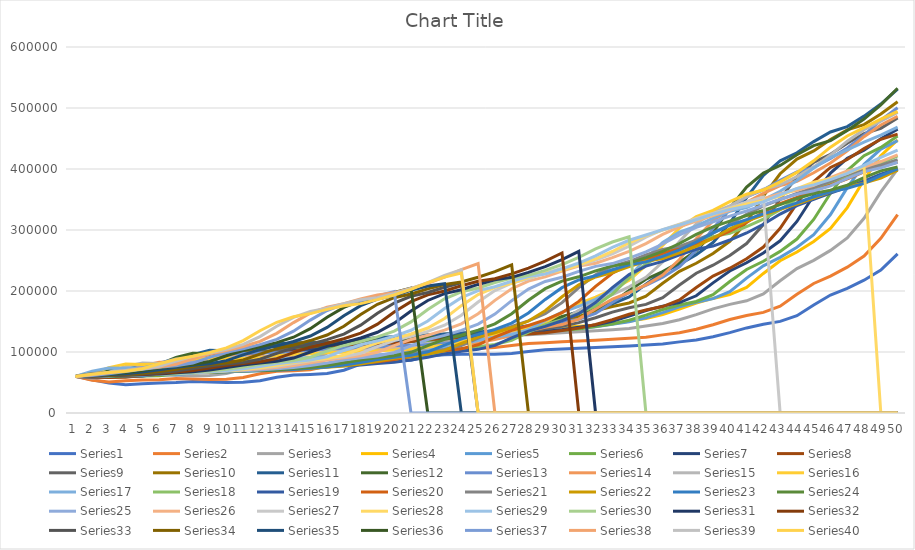
| Category | Series 0 | Series 1 | Series 2 | Series 3 | Series 4 | Series 5 | Series 6 | Series 7 | Series 8 | Series 9 | Series 10 | Series 11 | Series 12 | Series 13 | Series 14 | Series 15 | Series 16 | Series 17 | Series 18 | Series 19 | Series 20 | Series 21 | Series 22 | Series 23 | Series 24 | Series 25 | Series 26 | Series 27 | Series 28 | Series 29 | Series 30 | Series 31 | Series 32 | Series 33 | Series 34 | Series 35 | Series 36 | Series 37 | Series 38 | Series 39 |
|---|---|---|---|---|---|---|---|---|---|---|---|---|---|---|---|---|---|---|---|---|---|---|---|---|---|---|---|---|---|---|---|---|---|---|---|---|---|---|---|---|
| 0 | 60000 | 60000 | 60000 | 60000 | 60000 | 60000 | 60000 | 60000 | 60000 | 60000 | 60000 | 60000 | 60000 | 60000 | 60000 | 60000 | 60000 | 60000 | 60000 | 60000 | 60000 | 60000 | 60000 | 60000 | 60000 | 60000 | 60000 | 60000 | 60000 | 60000 | 60000 | 60000 | 60000 | 60000 | 60000 | 60000 | 60000 | 60000 | 60000 | 60000 |
| 1 | 54640.719 | 53819.178 | 56884.545 | 62087.629 | 61531.756 | 60619.308 | 62235.577 | 58783.314 | 59219.397 | 60431.396 | 63069.601 | 66553.48 | 63581.633 | 60982.186 | 61364.282 | 65085.688 | 68633.646 | 64613.662 | 59417.678 | 60651.033 | 64716.066 | 61367.576 | 60489.642 | 60186.799 | 59832.402 | 60915.033 | 62004.905 | 61637.496 | 60606.411 | 60874.786 | 60642.434 | 60719.264 | 60743.802 | 60767.347 | 60951.102 | 61809.045 | 61663.671 | 62563.078 | 63277.432 | 63502.953 |
| 2 | 49011.976 | 51024.658 | 58863.775 | 63672.68 | 62166.874 | 62877.96 | 60973.558 | 58018.54 | 59645.18 | 63523.068 | 69958.358 | 70526.316 | 64622.449 | 62368.801 | 66565.609 | 74451.135 | 73911.187 | 63986.562 | 60062.392 | 65418.271 | 66191.136 | 61868.379 | 60677.966 | 60018.68 | 60744.879 | 62950.514 | 63697.118 | 62260.457 | 61490.038 | 61526.587 | 61369.4 | 61471.982 | 61520.661 | 61730.612 | 62788.823 | 63522.878 | 64297.818 | 65980.515 | 66971.73 | 66228.987 |
| 3 | 46467.066 | 52800 | 60366.524 | 64329.897 | 64483.188 | 61602.914 | 60180.288 | 58435.689 | 62696.629 | 70461.354 | 74134.444 | 71680.815 | 66091.837 | 67655.272 | 76144.008 | 80176.007 | 73193.851 | 64680.851 | 64783.362 | 66909.345 | 66731.302 | 62060.995 | 60508.475 | 60933.997 | 62774.674 | 64668.534 | 64340.895 | 63168.199 | 62148.426 | 62264.151 | 62130.178 | 62258.154 | 62495.868 | 63591.837 | 64529.823 | 66236.445 | 67810.013 | 69832.626 | 69846.67 | 68396.184 |
| 4 | 48083.832 | 54147.945 | 60989.615 | 66726.804 | 63175.592 | 60801.457 | 60612.981 | 61425.261 | 69544.648 | 74667.466 | 75348.007 | 73310.696 | 71693.878 | 77390.467 | 81999.053 | 79397.869 | 73988.044 | 69764.838 | 66259.965 | 67455.373 | 66939.058 | 61887.64 | 61431.262 | 62970.112 | 64487.896 | 65322.129 | 65278.97 | 63844.557 | 62893.445 | 63036.021 | 62924.768 | 63245.052 | 64380.165 | 65355.102 | 67286.405 | 69854.536 | 71768.935 | 72830.377 | 72132.247 | 72621.536 |
| 5 | 49311.377 | 54706.849 | 63262.065 | 65373.711 | 62353.674 | 61238.616 | 63713.942 | 68134.415 | 73696.038 | 75889.754 | 77061.273 | 79524.618 | 82010.204 | 83341.358 | 81203.221 | 80259.379 | 79803.587 | 71354.983 | 66800.693 | 67665.383 | 66752.078 | 62831.461 | 63483.992 | 64688.667 | 65139.665 | 66274.51 | 65977.928 | 64609.908 | 63673.116 | 63842.196 | 63922.232 | 65151.938 | 66165.289 | 68146.939 | 70961.848 | 73932.822 | 74849.807 | 75213.59 | 76588.404 | 80649.705 |
| 6 | 49820.359 | 56745.205 | 61979.23 | 64523.196 | 62801.993 | 64371.585 | 70673.077 | 72201.622 | 74902.425 | 77615.339 | 83593.099 | 90967.742 | 88316.327 | 82532.499 | 82084.32 | 86567.855 | 81622.545 | 71937.29 | 67008.666 | 67476.374 | 67770.083 | 64930.979 | 65216.572 | 65342.466 | 66089.385 | 66984.127 | 66768.853 | 65410.857 | 64487.439 | 64854.202 | 65849.535 | 66958.461 | 68991.736 | 71869.388 | 75104.782 | 77106.586 | 77299.101 | 79860.105 | 85055.103 | 88023.626 |
| 7 | 51676.647 | 55594.521 | 61172.877 | 64987.113 | 66014.944 | 71402.55 | 74891.827 | 73383.546 | 76605.559 | 84194.128 | 95621.654 | 97962.649 | 87459.184 | 83428.021 | 88536.239 | 88540.991 | 82288.642 | 72161.254 | 66821.49 | 68505.425 | 70034.626 | 66703.05 | 65875.706 | 66295.143 | 66797.02 | 67787.115 | 67596.567 | 66247.404 | 65509.674 | 66809.605 | 67675.402 | 69818.79 | 72760.331 | 76065.306 | 78328.855 | 79629.728 | 82074.454 | 88688.484 | 92831.816 | 93080.418 |
| 8 | 50628.743 | 54871.233 | 61612.706 | 68311.856 | 73225.405 | 75664.845 | 76117.788 | 75052.144 | 83098.758 | 96309.167 | 102974.42 | 97011.885 | 88408.163 | 89985.556 | 90554.24 | 89263.548 | 82544.833 | 71959.686 | 67840.555 | 70794.54 | 71945.983 | 67377.207 | 66836.158 | 67004.981 | 67597.765 | 68627.451 | 68461.067 | 67297.538 | 67484.84 | 68662.093 | 70566.357 | 73632.562 | 77008.264 | 79330.612 | 80891.994 | 84549.061 | 91147.625 | 96797.402 | 98164.83 | 99132.213 |
| 9 | 49970.06 | 55265.753 | 64764.814 | 75773.196 | 77596.513 | 76903.461 | 77848.558 | 81413.673 | 95056.18 | 103714.799 | 101975.015 | 98064.516 | 95357.143 | 92036.591 | 91293.226 | 89541.454 | 82314.261 | 73057.111 | 70107.452 | 72726.636 | 72673.13 | 68359.551 | 67551.789 | 67808.219 | 68435.754 | 69505.135 | 69546.291 | 69326.609 | 69356.05 | 71595.197 | 74420.964 | 77931.419 | 80314.05 | 81926.531 | 85889.307 | 93895.795 | 99481.386 | 102358.231 | 104547.197 | 106696.956 |
| 10 | 50329.341 | 58093.151 | 71838.729 | 80296.392 | 78866.75 | 78652.095 | 84447.115 | 93128.621 | 102365.464 | 102708.209 | 103081.499 | 105772.496 | 97530.612 | 92787.675 | 91577.451 | 89291.339 | 83569.599 | 75498.32 | 72020.797 | 73461.673 | 73732.687 | 69091.493 | 68361.582 | 68648.817 | 69310.987 | 70606.909 | 71643.164 | 71248.888 | 72318.799 | 75506.003 | 78765.85 | 81276.833 | 82942.149 | 86987.755 | 95384.202 | 102480.825 | 105196.406 | 109013.24 | 112525.156 | 118705.134 |
| 11 | 52904.192 | 64438.356 | 76127.062 | 81610.825 | 80660.025 | 85318.761 | 96598.558 | 100289.687 | 101371.969 | 103822.648 | 111183.819 | 108183.362 | 98326.531 | 93076.553 | 91321.648 | 90653.08 | 86362.084 | 77558.791 | 72748.7 | 74532.727 | 74522.161 | 69919.743 | 69209.04 | 69526.775 | 70409.683 | 72735.761 | 73629.675 | 74292.495 | 76269.131 | 79914.237 | 82147.084 | 83936.437 | 88066.116 | 96604.082 | 104105.32 | 108368.157 | 112035.944 | 117332.001 | 125189.267 | 134788.732 |
| 12 | 58682.635 | 68284.932 | 77373.244 | 83466.495 | 87496.887 | 97595.628 | 104026.442 | 99316.338 | 102471.91 | 111983.223 | 113718.025 | 109066.214 | 98632.653 | 92816.562 | 92714.353 | 93682.26 | 88719.044 | 78342.665 | 73809.359 | 75330.767 | 75415.512 | 70786.517 | 70094.162 | 70628.892 | 72532.588 | 74752.568 | 76774.985 | 78350.638 | 80721.917 | 83344.768 | 84835.165 | 89121.829 | 97801.653 | 105436.735 | 110085.975 | 115413.912 | 120585.366 | 130537.097 | 142151.414 | 148718.764 |
| 13 | 62185.629 | 69402.74 | 79132.56 | 90541.237 | 100087.173 | 105100.182 | 103016.827 | 100393.975 | 110526.316 | 114535.65 | 114646.044 | 109405.772 | 98357.143 | 94232.065 | 95812.411 | 96239 | 89615.713 | 79484.882 | 74599.653 | 76233.812 | 76350.416 | 71691.814 | 71205.273 | 72758.406 | 74543.762 | 77945.845 | 80968.731 | 82924.948 | 84187.121 | 86072.041 | 90076.078 | 98974.073 | 106743.802 | 111493.878 | 117243.417 | 124221.106 | 134156.611 | 148223.832 | 156842.357 | 157837.347 |
| 14 | 63203.593 | 70980.822 | 85839.951 | 103569.588 | 107783.313 | 104080.146 | 104134.615 | 108285.052 | 113045.535 | 115470.342 | 115002.974 | 109100.17 | 99857.143 | 97380.838 | 98427.286 | 97211.672 | 90922.289 | 80335.946 | 75493.934 | 77178.859 | 77326.87 | 72828.25 | 73352.166 | 74775.841 | 77728.119 | 82203.548 | 85695.892 | 86484.723 | 86941.958 | 91389.365 | 100033.812 | 108023.418 | 112876.033 | 118742.857 | 126190.22 | 138201.534 | 152333.761 | 163542.343 | 166459.032 | 162907.769 |
| 15 | 64640.719 | 76997.26 | 98191.814 | 111533.505 | 106737.235 | 105209.472 | 112319.711 | 110753.187 | 113968.066 | 115829.838 | 114681.737 | 110764.007 | 103193.878 | 100038.517 | 99422.075 | 98628.995 | 91895.816 | 81298.992 | 76429.809 | 78165.908 | 78552.632 | 75024.077 | 75386.064 | 77970.112 | 81973.929 | 87002.801 | 89374.617 | 89314.743 | 92313.023 | 101492.281 | 109180.051 | 114229.161 | 120214.876 | 127804.082 | 140392.262 | 156926.739 | 168077.022 | 173569.823 | 171806.421 | 169913.676 |
| 16 | 70119.76 | 88076.712 | 105742.211 | 110451.031 | 107895.392 | 113479.053 | 114879.808 | 111657.01 | 114322.886 | 115506.291 | 116430.696 | 114465.195 | 106010.204 | 101049.591 | 100871.625 | 99685.039 | 92997.438 | 82306.831 | 77407.279 | 79404.97 | 80921.053 | 77104.334 | 78606.403 | 82229.141 | 86759.777 | 90737.628 | 92299.203 | 94832.394 | 102518.048 | 110771.87 | 115452.24 | 121655.98 | 129388.43 | 142187.755 | 159414.293 | 173144.671 | 178382.542 | 179145.641 | 179195.017 | 175938.21 |
| 17 | 80209.581 | 94849.315 | 104715.944 | 111649.485 | 116376.09 | 116065.574 | 115817.308 | 112004.635 | 114003.548 | 117267.825 | 120321.237 | 117589.134 | 107081.633 | 102522.87 | 101951.682 | 100880.037 | 94150.299 | 83359.462 | 78634.315 | 81799.09 | 83164.82 | 80398.074 | 82900.188 | 87029.888 | 90484.171 | 93706.816 | 98001.226 | 105315.93 | 111891.424 | 117135.506 | 122958.58 | 130939.504 | 143950.413 | 161453.061 | 175889.307 | 183760.91 | 184112.965 | 186849.863 | 185548.634 | 179277.601 |
| 18 | 86377.246 | 93928.767 | 105852.169 | 120425.258 | 119028.643 | 117012.75 | 116177.885 | 111691.773 | 115742.164 | 121186.339 | 123604.997 | 118777.589 | 108642.857 | 103620.607 | 103173.851 | 102130.616 | 95354.398 | 84680.851 | 81005.199 | 84067.203 | 86717.452 | 84789.727 | 87740.113 | 90765.878 | 93445.065 | 99495.798 | 108835.071 | 114945.12 | 118319.376 | 124751.286 | 132341.505 | 145676.052 | 163454.545 | 178138.776 | 186673.831 | 189664.11 | 192030.809 | 193474.894 | 189070.436 | 185847.342 |
| 19 | 85538.922 | 94947.945 | 114172.266 | 123170.103 | 120000 | 117377.049 | 115853.365 | 113395.133 | 119609.698 | 124493.709 | 124854.253 | 120509.338 | 109806.122 | 104862.783 | 104452.866 | 103436.776 | 96865.927 | 87234.043 | 83251.3 | 87658.383 | 91454.294 | 89739.968 | 91506.591 | 93735.99 | 99217.877 | 110494.865 | 118786.021 | 121548.502 | 126012.128 | 134271.012 | 147235.841 | 165413.995 | 180347.107 | 189061.224 | 192670.607 | 197820.682 | 198839.538 | 197147.14 | 195999.042 | 193425.716 |
| 20 | 86467.066 | 102410.959 | 116774.588 | 124175.258 | 120373.599 | 117049.18 | 117620.192 | 117184.241 | 122874.039 | 125751.947 | 126674.598 | 121799.66 | 111122.449 | 106162.735 | 105788.726 | 105076.424 | 99786.507 | 89652.856 | 86807.626 | 92446.622 | 96793.629 | 93592.295 | 94500.942 | 99526.775 | 110186.22 | 120597.572 | 125610.055 | 129451.201 | 135628.068 | 149382.504 | 167185.123 | 182509.06 | 191404.959 | 195134.694 | 200956.475 | 204834.7 | 0 | 204371.721 | 203991.375 | 202762.381 |
| 21 | 93263.473 | 104745.206 | 117727.55 | 124561.856 | 120037.36 | 118834.244 | 121550.481 | 120382.387 | 124115.908 | 127585.38 | 128030.934 | 123259.762 | 112500 | 107520.462 | 107465.656 | 108244.558 | 102553.373 | 93482.643 | 91549.393 | 97843.892 | 100948.753 | 96654.896 | 100338.983 | 110529.265 | 120260.708 | 127525.677 | 133776.824 | 139329.576 | 150892.29 | 169622.642 | 184463.229 | 193699.47 | 197553.719 | 203526.531 | 208081.677 | 0 | 0 | 212705.471 | 213838.045 | 213707.406 |
| 22 | 95389.222 | 105600 | 118094.074 | 124213.918 | 121867.995 | 122805.1 | 124867.788 | 121599.073 | 125925.488 | 128951.468 | 129565.735 | 124787.776 | 113938.776 | 109224.844 | 110705.827 | 111245.947 | 106934.244 | 98589.026 | 96894.281 | 102044.102 | 104252.078 | 102626.003 | 111431.262 | 120635.118 | 127169.46 | 135816.993 | 143985.285 | 155010.383 | 171336.991 | 187152.659 | 195773.457 | 199921.94 | 206049.587 | 210742.857 | 212031.166 | 0 | 0 | 222972.771 | 225380.93 | 222757.837 |
| 23 | 96167.665 | 105928.767 | 117764.203 | 126108.247 | 125940.224 | 126156.648 | 126129.808 | 123371.958 | 127273.802 | 130497.304 | 131171.922 | 126383.701 | 115744.898 | 112518.055 | 113775.462 | 115998.147 | 112775.406 | 104344.905 | 101053.726 | 105383.269 | 110692.521 | 113971.108 | 121619.586 | 127565.38 | 135437.616 | 146181.139 | 160190.067 | 176013.052 | 189044.181 | 198627.787 | 202062.553 | 208519.654 | 213355.372 | 214742.857 | 0 | 0 | 0 | 235008.743 | 234925.731 | 229504.771 |
| 24 | 96467.066 | 105632.877 | 119560.171 | 130322.165 | 129377.335 | 127431.694 | 127968.75 | 124692.932 | 128799.527 | 132115.039 | 132849.494 | 128387.097 | 119234.694 | 115637.939 | 118635.718 | 122334.414 | 119359.522 | 108824.188 | 104360.485 | 111893.595 | 122929.363 | 124391.653 | 128606.403 | 135859.278 | 145772.812 | 162633.053 | 181894.543 | 194203.5 | 200635.287 | 205008.576 | 210752.325 | 215913.019 | 0 | 222612.245 | 0 | 0 | 0 | 244961.279 | 0 | 0 |
| 25 | 96197.605 | 107243.836 | 123555.284 | 133878.866 | 130684.932 | 129289.617 | 129338.942 | 126187.717 | 130396.215 | 133804.674 | 134955.384 | 132258.065 | 122540.816 | 120577.756 | 125116.059 | 129476.61 | 124483.348 | 112385.218 | 110807.626 | 124263.213 | 134168.975 | 131537.721 | 136967.985 | 146226.65 | 162178.771 | 184668.534 | 200692.827 | 206110.946 | 207080.566 | 213825.043 | 218224.852 | 220011.151 | 0 | 231689.796 | 0 | 0 | 0 | 0 | 0 | 0 |
| 26 | 97664.671 | 110827.397 | 126927.306 | 135231.959 | 132590.286 | 130673.953 | 130889.423 | 127752.028 | 132063.868 | 135925.704 | 139024.39 | 135925.297 | 127775.51 | 127164.179 | 132420.654 | 135034.738 | 128556.789 | 119328.108 | 123057.192 | 135624.781 | 141876.731 | 140089.888 | 147419.962 | 162683.686 | 184152.7 | 203753.501 | 212998.161 | 212732.127 | 215986.139 | 221406.518 | 222366.864 | 228073.599 | 0 | 242873.469 | 0 | 0 | 0 | 0 | 0 | 0 |
| 27 | 100928.144 | 113852.055 | 128210.14 | 137203.608 | 134009.963 | 132240.437 | 132512.019 | 129385.863 | 134157.303 | 140023.966 | 142879.239 | 141731.749 | 134755.102 | 134588.349 | 138105.163 | 139453.451 | 136498.719 | 132519.597 | 134308.492 | 143416.171 | 151101.108 | 150780.096 | 164011.299 | 184726.027 | 203184.358 | 216246.499 | 219840.589 | 221880.747 | 223644.239 | 225608.919 | 230515.638 | 237373.85 | 0 | 0 | 0 | 0 | 0 | 0 | 0 | 0 |
| 28 | 103682.635 | 115002.74 | 130079.414 | 138672.68 | 135616.438 | 133879.781 | 134206.731 | 131436.848 | 138202.247 | 143906.531 | 148982.748 | 149473.684 | 142622.449 | 140365.912 | 142624.349 | 148068.55 | 151588.386 | 144636.058 | 142024.263 | 152740.637 | 162631.579 | 167749.599 | 186233.522 | 203816.936 | 215642.458 | 223193.277 | 229294.911 | 229747.849 | 227889.113 | 233876.501 | 239915.469 | 248831.893 | 0 | 0 | 0 | 0 | 0 | 0 | 0 | 0 |
| 29 | 104730.539 | 116679.452 | 131472.205 | 140335.052 | 137297.634 | 135591.985 | 136334.135 | 135399.768 | 142034.299 | 150053.925 | 157120.761 | 158200.34 | 148744.898 | 144959.076 | 151435.339 | 164437.239 | 165448.335 | 152945.129 | 151258.232 | 164396.22 | 180934.903 | 190478.331 | 205480.226 | 216313.823 | 222569.832 | 232791.783 | 237424.893 | 234108.573 | 236240.254 | 243413.379 | 251496.196 | 262263.73 | 0 | 0 | 0 | 0 | 0 | 0 | 0 | 0 |
| 30 | 106257.485 | 117928.767 | 133048.259 | 142074.742 | 139053.549 | 137741.348 | 140444.711 | 139154.114 | 148101.715 | 158250.449 | 166293.873 | 164991.511 | 153612.245 | 153914.3 | 168176.22 | 179471.978 | 174953.032 | 162889.138 | 162800.693 | 182898.145 | 205450.138 | 210163.724 | 218079.096 | 223262.765 | 232141.527 | 241045.752 | 241931.33 | 242687.63 | 245873.52 | 255162.95 | 265071.851 | 0 | 0 | 0 | 0 | 0 | 0 | 0 | 0 | 0 |
| 31 | 107395.21 | 119342.466 | 134697.618 | 143891.753 | 141257.783 | 141894.353 | 144338.942 | 145098.494 | 156191.603 | 167489.515 | 173432.481 | 170390.492 | 163102.041 | 170929.225 | 183552.819 | 189782.307 | 186327.925 | 175319.149 | 181123.05 | 207679.384 | 226682.825 | 223049.759 | 225084.746 | 232864.259 | 240372.44 | 245620.915 | 250797.057 | 252583.803 | 257741.842 | 268936.535 | 0 | 0 | 0 | 0 | 0 | 0 | 0 | 0 | 0 | 0 |
| 32 | 108682.635 | 120821.918 | 136420.281 | 146172.68 | 145516.812 | 145828.78 | 150504.808 | 153024.334 | 165310.467 | 174679.449 | 179107.674 | 180916.808 | 181132.653 | 186557.535 | 194097.584 | 202121.352 | 200546.541 | 195050.392 | 205663.778 | 229142.457 | 240581.717 | 230215.088 | 234764.595 | 241120.797 | 244934.823 | 254621.849 | 261023.912 | 264776.031 | 271654.635 | 280325.901 | 0 | 0 | 0 | 0 | 0 | 0 | 0 | 0 | 0 | 0 |
| 33 | 110029.94 | 122367.123 | 138582.773 | 150579.897 | 149551.681 | 152058.288 | 158725.961 | 161958.285 | 172406.86 | 180395.446 | 190172.516 | 200916.808 | 197693.878 | 197274.916 | 206717.196 | 217545.16 | 223116.994 | 221478.163 | 226918.544 | 243192.16 | 248310.249 | 240115.57 | 243088.512 | 245697.385 | 253910.615 | 265004.668 | 273623.544 | 279068.526 | 283159.111 | 288816.467 | 0 | 0 | 0 | 0 | 0 | 0 | 0 | 0 | 0 | 0 |
| 34 | 111437.126 | 124306.849 | 142761.148 | 154755.155 | 155940.224 | 160364.299 | 167992.788 | 168910.776 | 178048.492 | 191539.844 | 211195.717 | 219286.927 | 209051.02 | 210101.107 | 222491.71 | 242028.717 | 253347.566 | 244367.301 | 240831.889 | 251004.55 | 258988.92 | 248629.214 | 247702.448 | 254701.121 | 264264.432 | 277796.452 | 288393.624 | 290886.977 | 291735.49 | 0 | 0 | 0 | 0 | 0 | 0 | 0 | 0 | 0 | 0 | 0 |
| 35 | 113203.593 | 128054.795 | 146719.609 | 161365.979 | 164458.281 | 169726.776 | 175204.327 | 174438.007 | 189047.901 | 212714.2 | 230505.651 | 231884.55 | 222642.857 | 226133.847 | 247531.975 | 274821.677 | 279530.316 | 259350.504 | 248568.458 | 261799.09 | 268171.745 | 253348.315 | 256779.661 | 265087.173 | 277020.484 | 292791.783 | 300606.99 | 299697.419 | 300346.52 | 0 | 0 | 0 | 0 | 0 | 0 | 0 | 0 | 0 | 0 | 0 |
| 36 | 116616.766 | 131605.479 | 152987.172 | 170180.412 | 174059.776 | 177012.75 | 180937.5 | 185214.369 | 209946.777 | 232162.972 | 243747.769 | 246960.951 | 239632.653 | 251584.015 | 281070.583 | 303223.715 | 296669.513 | 267681.971 | 259258.232 | 271081.554 | 273261.773 | 262632.424 | 267250.471 | 277882.939 | 291973.929 | 305191.41 | 309711.833 | 308543.459 | 308177.88 | 0 | 0 | 0 | 0 | 0 | 0 | 0 | 0 | 0 | 0 | 0 |
| 37 | 119850.299 | 137227.397 | 161343.922 | 180115.979 | 181531.756 | 182805.1 | 192115.385 | 205689.455 | 229142.519 | 245500.3 | 259595.479 | 265806.452 | 266602.041 | 285671.642 | 310118.427 | 321815.655 | 306199.829 | 279193.729 | 268450.607 | 276226.811 | 283275.623 | 273341.894 | 280150.659 | 292882.939 | 304338.92 | 314435.107 | 318853.464 | 316588.549 | 316823.563 | 0 | 0 | 0 | 0 | 0 | 0 | 0 | 0 | 0 | 0 | 0 |
| 38 | 124970.06 | 144723.288 | 170763.592 | 187847.938 | 187471.98 | 194098.361 | 213353.365 | 224495.944 | 242306.328 | 261461.953 | 279405.116 | 295721.562 | 302724.49 | 315194.993 | 329133.112 | 332153.775 | 319368.061 | 289092.945 | 273545.927 | 286349.318 | 294826.87 | 286536.116 | 295273.07 | 305286.426 | 313556.797 | 323716.153 | 327167.382 | 325470.187 | 326110.309 | 0 | 0 | 0 | 0 | 0 | 0 | 0 | 0 | 0 | 0 | 0 |
| 39 | 131796.407 | 153172.603 | 178094.074 | 193994.845 | 199053.549 | 215555.556 | 232860.577 | 237392.816 | 258060.319 | 281414.02 | 310850.684 | 335789.474 | 334010.204 | 334520.944 | 339706.3 | 346438.166 | 330691.717 | 294580.067 | 283570.191 | 298025.901 | 309058.172 | 302003.21 | 307777.778 | 314533.001 | 322811.918 | 332156.863 | 336345.8 | 335010.383 | 333733.757 | 0 | 0 | 0 | 0 | 0 | 0 | 0 | 0 | 0 | 0 | 0 |
| 40 | 139491.018 | 159747.945 | 183921.808 | 205979.381 | 221058.531 | 235264.117 | 246237.981 | 252827.347 | 277752.809 | 313085.68 | 352968.471 | 370492.36 | 354489.796 | 345267.212 | 354315.49 | 358721.63 | 336968.403 | 305375.14 | 295133.449 | 312411.621 | 325740.997 | 314792.938 | 317099.812 | 323816.936 | 331229.05 | 341475.257 | 346204.782 | 342841.887 | 338914.236 | 0 | 0 | 0 | 0 | 0 | 0 | 0 | 0 | 0 | 0 | 0 |
| 41 | 145479.042 | 164975.343 | 195284.056 | 228750 | 241270.237 | 248779.599 | 262247.596 | 272120.51 | 309012.419 | 355506.291 | 389446.758 | 393208.829 | 365877.551 | 360115.551 | 366878.257 | 365530.338 | 349316.823 | 317827.548 | 309379.549 | 329275.464 | 339536.011 | 324327.448 | 326459.51 | 332260.274 | 340521.415 | 351484.594 | 354297.977 | 348163.75 | 346329.772 | 0 | 0 | 0 | 0 | 0 | 0 | 0 | 0 | 0 | 0 | 0 |
| 42 | 150239.521 | 175167.123 | 216872.327 | 249664.949 | 255130.76 | 264954.463 | 282259.615 | 302746.234 | 350881.135 | 392246.854 | 413325.402 | 405840.407 | 381612.245 | 372883.967 | 373841.781 | 378925.428 | 363561.059 | 333169.093 | 326079.723 | 343220.161 | 349819.945 | 333900.482 | 334971.751 | 341581.569 | 350502.793 | 359701.214 | 0 | 355781.667 | 358024.834 | 0 | 0 | 0 | 0 | 0 | 0 | 0 | 0 | 0 | 0 | 0 |
| 43 | 159520.958 | 194531.507 | 236701.283 | 264007.732 | 271718.555 | 285173.042 | 314026.442 | 343765.933 | 387143.702 | 416297.184 | 426603.212 | 423293.718 | 395142.857 | 379961.483 | 387541.449 | 394377.026 | 381110.162 | 351153.415 | 339889.081 | 353615.681 | 360145.429 | 342606.742 | 344369.115 | 351594.022 | 358696.462 | 365284.781 | 0 | 367795.906 | 368143.229 | 0 | 0 | 0 | 0 | 0 | 0 | 0 | 0 | 0 | 0 | 0 |
| 44 | 177155.689 | 212317.808 | 250299.328 | 281172.68 | 292453.3 | 317267.76 | 356574.519 | 379293.163 | 410881.135 | 429670.461 | 444949.435 | 438302.207 | 402642.857 | 393885.412 | 403344.386 | 413413.617 | 401682.323 | 366024.636 | 350183.709 | 364053.203 | 369536.011 | 352218.299 | 354463.277 | 359813.201 | 364264.432 | 373277.311 | 0 | 378190.448 | 373982.096 | 0 | 0 | 0 | 0 | 0 | 0 | 0 | 0 | 0 | 0 | 0 |
| 45 | 193353.293 | 224515.069 | 266572.999 | 302628.866 | 325367.372 | 360255.009 | 393425.481 | 402549.247 | 424080.426 | 448148.592 | 460725.759 | 446621.392 | 417397.959 | 409947.039 | 422813.832 | 435729.504 | 418693.424 | 377110.862 | 360519.931 | 373545.677 | 379903.047 | 362542.536 | 362749.529 | 365398.505 | 372234.637 | 385882.353 | 0 | 384188.668 | 382471.845 | 0 | 0 | 0 | 0 | 0 | 0 | 0 | 0 | 0 | 0 | 0 |
| 46 | 204461.078 | 239112.329 | 286915.088 | 336688.144 | 369452.055 | 397486.339 | 417548.077 | 415480.881 | 442318.155 | 464038.347 | 469470.553 | 462988.115 | 434418.367 | 429735.195 | 445637.139 | 454182.492 | 431374.893 | 388241.881 | 369920.277 | 384025.201 | 391038.781 | 371017.657 | 368380.414 | 373393.524 | 384804.469 | 396788.049 | 0 | 392910.116 | 392711.522 | 0 | 0 | 0 | 0 | 0 | 0 | 0 | 0 | 0 | 0 | 0 |
| 47 | 217754.491 | 257358.904 | 319205.864 | 382306.701 | 407633.873 | 421857.923 | 430961.538 | 433348.783 | 458001.183 | 472846.016 | 486674.599 | 481867.572 | 455387.755 | 452932.114 | 464509.711 | 467938.861 | 444107.6 | 398365.062 | 380298.093 | 395281.764 | 400180.055 | 376776.886 | 376440.678 | 386002.491 | 395679.702 | 403081.232 | 0 | 403429.249 | 406035.23 | 0 | 0 | 0 | 0 | 0 | 0 | 0 | 0 | 0 | 0 | 0 |
| 48 | 234371.257 | 286323.288 | 362455.712 | 421817.01 | 432627.646 | 435409.836 | 449495.192 | 448713.789 | 466694.263 | 490173.757 | 506519.929 | 505127.335 | 479969.388 | 472113.626 | 478578.873 | 481750.81 | 455687.447 | 409540.873 | 391445.407 | 404522.226 | 406391.967 | 385020.867 | 389152.542 | 396911.582 | 401955.307 | 412231.559 | 0 | 0 | 419133.699 | 0 | 0 | 0 | 0 | 0 | 0 | 0 | 0 | 0 | 0 | 0 |
| 49 | 260748.503 | 325117.808 | 399914.478 | 447680.412 | 446525.529 | 454134.79 | 465432.692 | 457230.591 | 483796.57 | 510161.773 | 530969.661 | 532393.888 | 500295.919 | 486413.096 | 492704.879 | 494312.181 | 468471.392 | 421545.353 | 400596.187 | 410801.54 | 415283.933 | 398022.472 | 400150.659 | 403206.725 | 411080.074 | 423267.974 | 0 | 0 | 431090.211 | 0 | 0 | 0 | 0 | 0 | 0 | 0 | 0 | 0 | 0 | 0 |